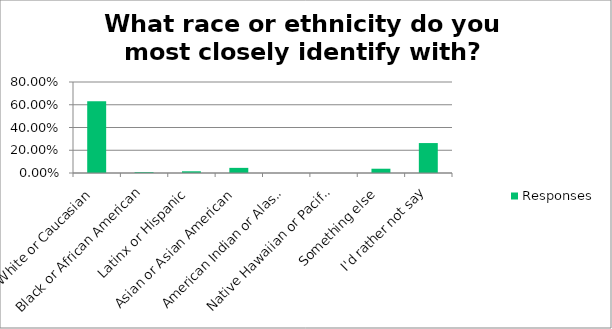
| Category | Responses |
|---|---|
| White or Caucasian | 0.632 |
| Black or African American | 0.008 |
| Latinx or Hispanic | 0.015 |
| Asian or Asian American | 0.045 |
| American Indian or Alaska Native | 0 |
| Native Hawaiian or Pacific Islander | 0 |
| Something else | 0.038 |
| I'd rather not say | 0.263 |